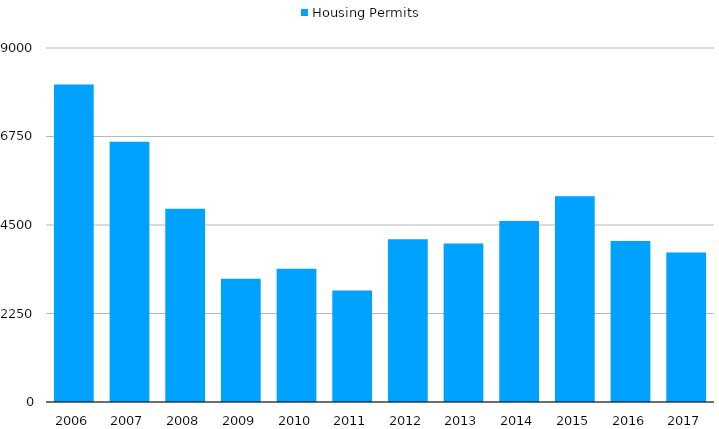
| Category | Housing Permits |
|---|---|
| 2006 | 8073 |
| 2007 | 6619 |
| 2008 | 4910 |
| 2009 | 3136 |
| 2010 | 3385 |
| 2011 | 2837 |
| 2012 | 4140 |
| 2013 | 4027 |
| 2014 | 4603 |
| 2015 | 5233 |
| 2016 | 4095 |
| 2017 | 3803 |